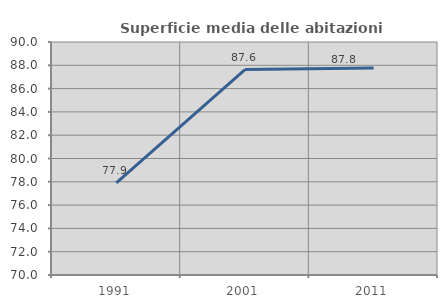
| Category | Superficie media delle abitazioni occupate |
|---|---|
| 1991.0 | 77.905 |
| 2001.0 | 87.63 |
| 2011.0 | 87.77 |